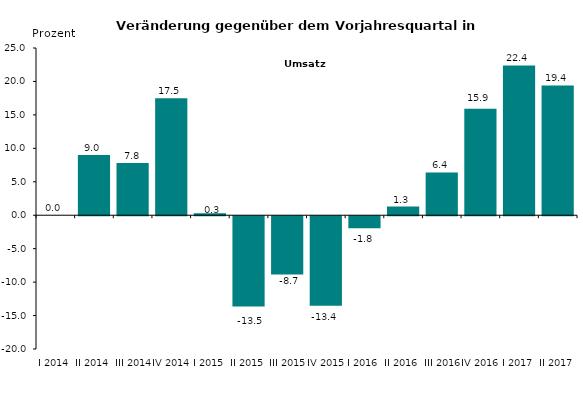
| Category | 0,0 9,0 7,8 17,5 0,3 -13,5 -8,7 -13,4 -1,8 1,3 6,4 15,9 22,4 19,4 |
|---|---|
| I 2014 | 0 |
| II 2014 | 9 |
| III 2014 | 7.8 |
| IV 2014 | 17.5 |
| I 2015 | 0.3 |
| II 2015 | -13.5 |
| III 2015 | -8.7 |
| IV 2015 | -13.4 |
| I 2016 | -1.8 |
| II 2016 | 1.3 |
| III 2016 | 6.4 |
| IV 2016 | 15.9 |
| I 2017 | 22.4 |
| II 2017 | 19.4 |